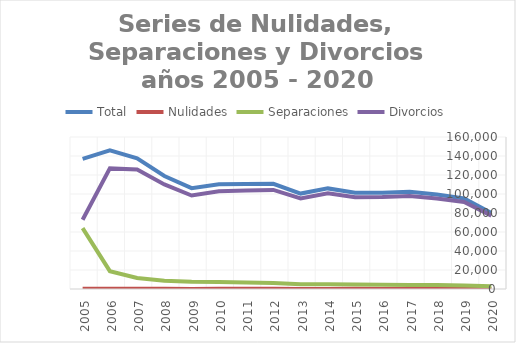
| Category | Total | Nulidades | Separaciones | Divorcios |
|---|---|---|---|---|
| 2020 | 80015 | 40 | 2775 | 77200 |
| 2019 | 95320 | 75 | 3599 | 91645 |
| 2018 | 99444 | 92 | 4098 | 95254 |
| 2017 | 102341 | 100 | 4280 | 97960 |
| 2016 | 101294 | 117 | 4353 | 96824 |
| 2015 | 101357 | 144 | 4652 | 96562 |
| 2014 | 105893 | 113 | 5034 | 100746 |
| 2013 | 100437 | 110 | 4900 | 95427 |
| 2012 | 110764 | 133 | 6369 | 104262 |
| 2011 | 110651 | 132 | 6915 | 103604 |
| 2010 | 110321 | 140 | 7248 | 102933 |
| 2009 | 106166 | 127 | 7680 | 98359 |
| 2008 | 118939 | 142 | 8761 | 110036 |
| 2007 | 137510 | 150 | 11583 | 125777 |
| 2006 | 145919 | 174 | 18793 | 126952 |
| 2005 | 137044 | 168 | 64028 | 72848 |